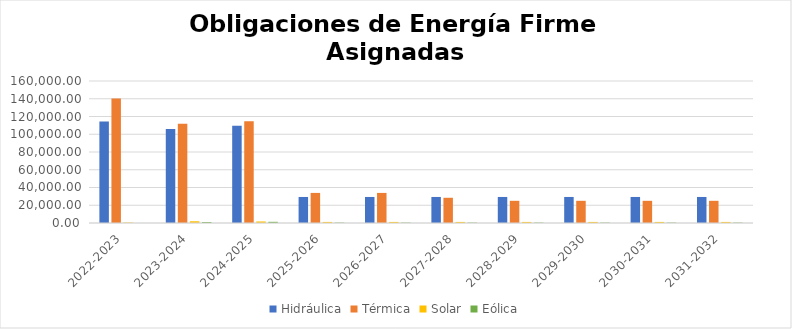
| Category | Hidráulica | Térmica | Solar | Eólica |
|---|---|---|---|---|
| 2022-2023 | 114457.955 | 140401.207 | 524.465 | 0 |
| 2023-2024 | 105838.438 | 111810.187 | 1963.44 | 1131.16 |
| 2024-2025 | 109714.574 | 114706.438 | 1726.445 | 1333.26 |
| 2025-2026 | 29337.2 | 33897.379 | 1201.98 | 445.015 |
| 2026-2027 | 29337.2 | 33897.379 | 1201.98 | 445.015 |
| 2027-2028 | 29337.2 | 28424.929 | 1201.98 | 445.015 |
| 2028-2029 | 29337.2 | 25004.932 | 1201.98 | 445.015 |
| 2029-2030 | 29337.2 | 25004.932 | 1201.98 | 445.015 |
| 2030-2031 | 29337.2 | 25004.932 | 1201.98 | 445.015 |
| 2031-2032 | 29337.2 | 25004.932 | 1201.98 | 445.015 |